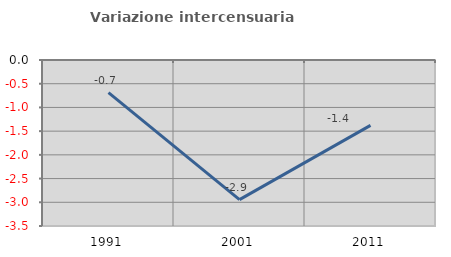
| Category | Variazione intercensuaria annua |
|---|---|
| 1991.0 | -0.688 |
| 2001.0 | -2.943 |
| 2011.0 | -1.379 |